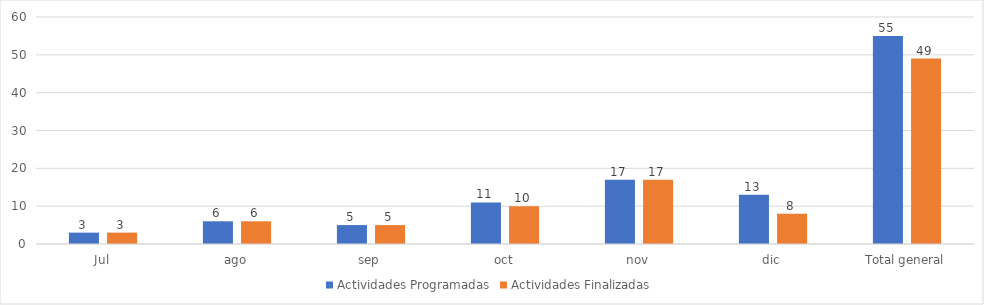
| Category | Actividades Programadas | Actividades Finalizadas |
|---|---|---|
| Jul | 3 | 3 |
| ago | 6 | 6 |
| sep | 5 | 5 |
| oct | 11 | 10 |
| nov | 17 | 17 |
| dic | 13 | 8 |
| Total general | 55 | 49 |